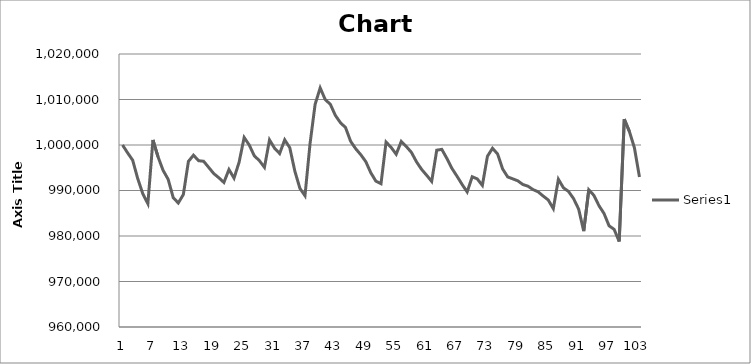
| Category | Series 0 |
|---|---|
| 0 | 1000000 |
| 1 | 998274.637 |
| 2 | 996660.205 |
| 3 | 992600.969 |
| 4 | 989287.022 |
| 5 | 987091.007 |
| 6 | 1001112.547 |
| 7 | 997414.109 |
| 8 | 994431.879 |
| 9 | 992466.344 |
| 10 | 988436.187 |
| 11 | 987250.404 |
| 12 | 989108.239 |
| 13 | 996400.646 |
| 14 | 997761.982 |
| 15 | 996552.504 |
| 16 | 996422.186 |
| 17 | 995077.006 |
| 18 | 993718.901 |
| 19 | 992801.292 |
| 20 | 991769.521 |
| 21 | 994609.585 |
| 22 | 992718.363 |
| 23 | 996214.324 |
| 24 | 1001651.05 |
| 25 | 1000006.462 |
| 26 | 997619.817 |
| 27 | 996567.582 |
| 28 | 995084.545 |
| 29 | 1001125.471 |
| 30 | 999288.099 |
| 31 | 998124.933 |
| 32 | 1001139.472 |
| 33 | 999408.724 |
| 34 | 994248.788 |
| 35 | 990465.267 |
| 36 | 988856.22 |
| 37 | 1000314.486 |
| 38 | 1008940.226 |
| 39 | 1012549.273 |
| 40 | 1009974.152 |
| 41 | 1008953.15 |
| 42 | 1006496.5 |
| 43 | 1004897.146 |
| 44 | 1003838.449 |
| 45 | 1000835.757 |
| 46 | 999187.938 |
| 47 | 997879.375 |
| 48 | 996343.565 |
| 49 | 993872.913 |
| 50 | 992039.849 |
| 51 | 991500.269 |
| 52 | 1000648.358 |
| 53 | 999462.574 |
| 54 | 997969.844 |
| 55 | 1000790.522 |
| 56 | 999658.589 |
| 57 | 998380.183 |
| 58 | 996314.486 |
| 59 | 994659.128 |
| 60 | 993357.027 |
| 61 | 992000 |
| 62 | 998859.451 |
| 63 | 999041.465 |
| 64 | 997044.696 |
| 65 | 994854.066 |
| 66 | 993134.087 |
| 67 | 991337.641 |
| 68 | 989682.283 |
| 69 | 993019.925 |
| 70 | 992547.119 |
| 71 | 991119.009 |
| 72 | 997515.347 |
| 73 | 999287.022 |
| 74 | 998035.541 |
| 75 | 994731.287 |
| 76 | 992984.383 |
| 77 | 992560.043 |
| 78 | 992124.933 |
| 79 | 991312.87 |
| 80 | 990949.919 |
| 81 | 990204.631 |
| 82 | 989712.439 |
| 83 | 988780.829 |
| 84 | 987920.302 |
| 85 | 986012.924 |
| 86 | 992473.883 |
| 87 | 990586.968 |
| 88 | 989795.369 |
| 89 | 988217.555 |
| 90 | 985910.609 |
| 91 | 981068.39 |
| 92 | 990157.243 |
| 93 | 988943.457 |
| 94 | 986680.668 |
| 95 | 984967.151 |
| 96 | 982246.634 |
| 97 | 981459.343 |
| 98 | 978782.983 |
| 99 | 1005674.744 |
| 100 | 1003015.617 |
| 101 | 999407.647 |
| 102 | 992985.46 |